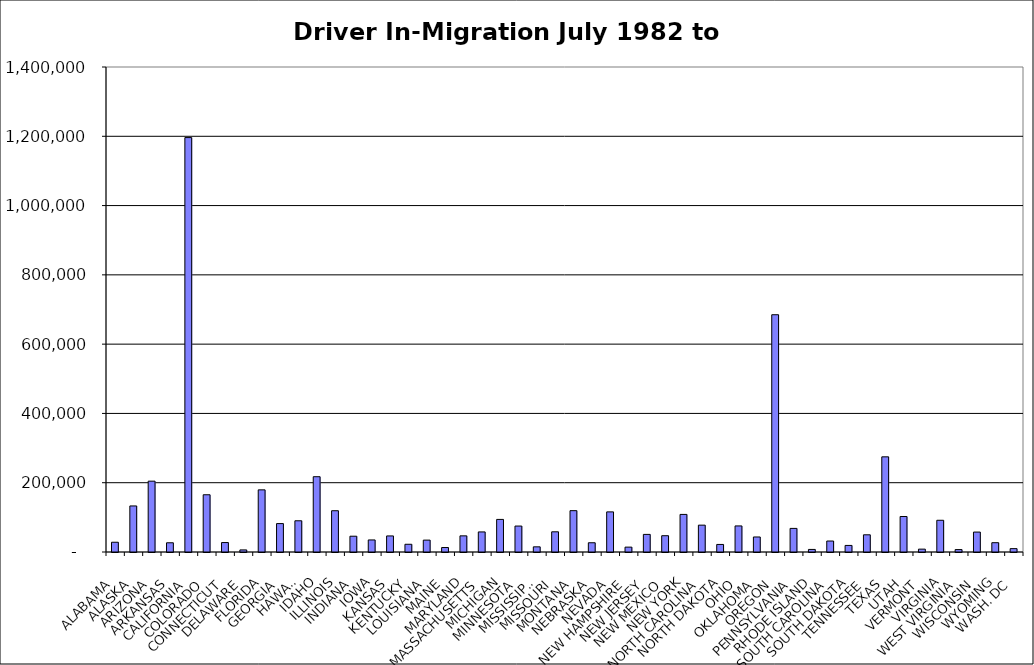
| Category | Series 0 |
|---|---|
| ALABAMA | 28155.5 |
| ALASKA | 132949.5 |
| ARIZONA | 204494 |
| ARKANSAS | 26653.5 |
| CALIFORNIA | 1196224.5 |
| COLORADO | 165226 |
| CONNECTICUT | 27283 |
| DELAWARE | 6031.5 |
| FLORIDA | 179410 |
| GEORGIA | 82042 |
| HAWAII | 90142.5 |
| IDAHO | 217336.5 |
| ILLINOIS | 119135.5 |
| INDIANA | 45555 |
| IOWA | 34817.5 |
| KANSAS | 46373.5 |
| KENTUCKY | 22294 |
| LOUISIANA | 34280.5 |
| MAINE | 12937.5 |
| MARYLAND | 46621 |
| MASSACHUSETTS | 57942 |
| MICHIGAN | 94078 |
| MINNESOTA | 74911.5 |
| MISSISSIPPI | 14916 |
| MISSOURI | 58280 |
| MONTANA | 119314 |
| NEBRASKA | 26684.5 |
| NEVADA | 115791 |
| NEW HAMPSHIRE | 14071.5 |
| NEW JERSEY | 50795 |
| NEW MEXICO | 47010 |
| NEW YORK | 108488 |
| NORTH CAROLINA | 77526.5 |
| NORTH DAKOTA | 21829.5 |
| OHIO | 75268.5 |
| OKLAHOMA | 43352 |
| OREGON | 684935 |
| PENNSYLVANIA | 68143.5 |
| RHODE ISLAND | 7400 |
| SOUTH CAROLINA | 31688.5 |
| SOUTH DAKOTA | 18962.5 |
| TENNESSEE | 49651.5 |
| TEXAS | 274713 |
| UTAH | 102438.5 |
| VERMONT | 8263 |
| VIRGINIA | 91589 |
| WEST VIRGINIA | 6978.5 |
| WISCONSIN | 57541.5 |
| WYOMING | 26850 |
| WASH. DC | 9709 |